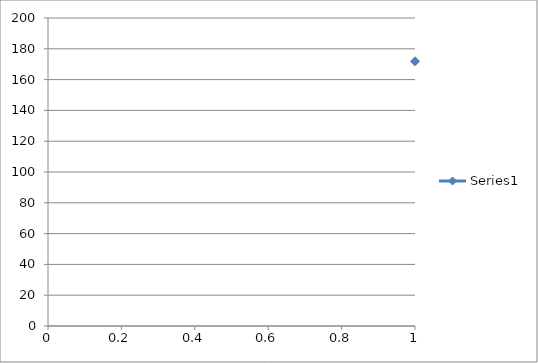
| Category | Series 0 |
|---|---|
| 0 | 171.9 |
| 1 | 153.8 |
| 2 | 121.2 |
| 3 | 125.9 |
| 4 | 137.4 |
| 5 | 142 |
| 6 | 140.6 |
| 7 | 135.1 |
| 8 | 128.6 |
| 9 | 132.7 |
| 10 | 139.2 |
| 11 | 140.7 |
| 12 | 139.4 |
| 13 | 138.6 |
| 14 | 136 |
| 15 | 135.5 |
| 16 | 135.6 |
| 17 | 132.8 |
| 18 | 133.9 |
| 19 | 133.6 |
| 20 | 135.8 |
| 21 | 138.5 |
| 22 | 139.2 |